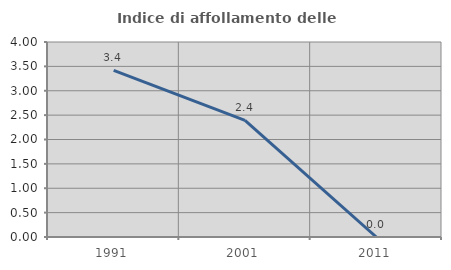
| Category | Indice di affollamento delle abitazioni  |
|---|---|
| 1991.0 | 3.419 |
| 2001.0 | 2.392 |
| 2011.0 | 0 |